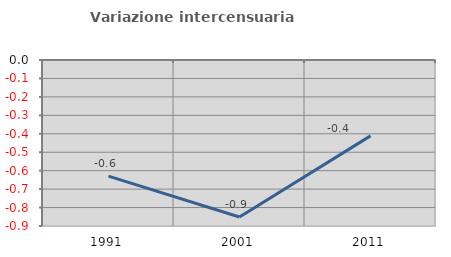
| Category | Variazione intercensuaria annua |
|---|---|
| 1991.0 | -0.63 |
| 2001.0 | -0.851 |
| 2011.0 | -0.411 |